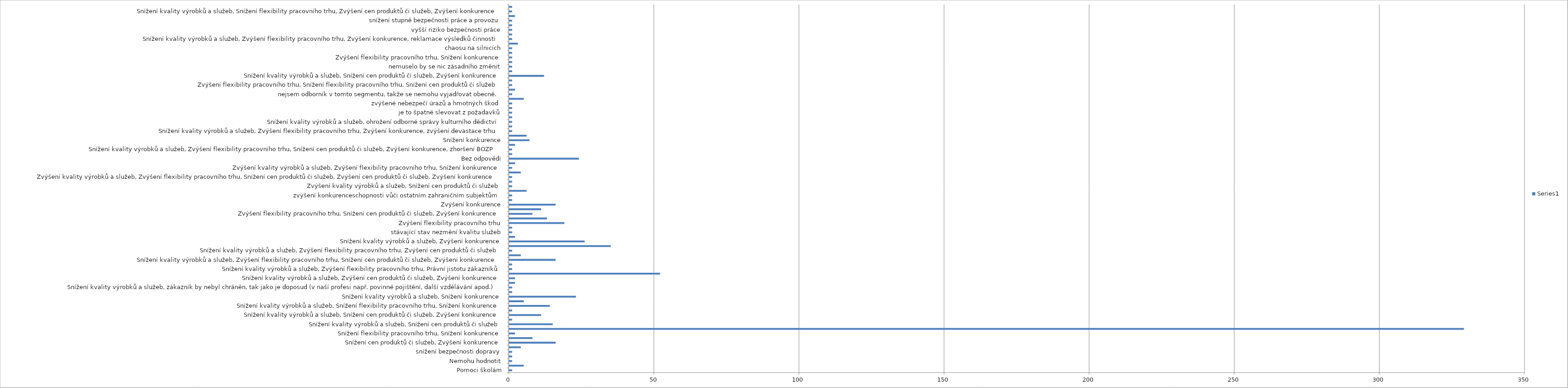
| Category | Series 0 |
|---|---|
| Pomoci školám | 1 |
| Nemám názor | 5 |
| Nemohu hodnotit | 1 |
| požadavky žádné nejsou - kvalita již nízká je | 1 |
| snížení bezpečnosti dopravy | 1 |
| Snížení cen produktů či služeb | 4 |
| Snížení cen produktů či služeb, Zvýšení konkurence | 16 |
| Snížení flexibility pracovního trhu | 8 |
| Snížení flexibility pracovního trhu, Snížení konkurence | 2 |
| Snížení kvality výrobků a služeb | 329 |
| Snížení kvality výrobků a služeb, Snížení cen produktů či služeb | 15 |
| Snížení kvality výrobků a služeb, k excesům v oblasti přestupků a trestního práva | 1 |
| Snížení kvality výrobků a služeb, Snížení cen produktů či služeb, Zvýšení konkurence | 11 |
| Snížení kvality výrobků a služeb, Snížení cen produktů či služeb, Zvýšení konkurence, konkurence nekalé | 1 |
| Snížení kvality výrobků a služeb, Snížení flexibility pracovního trhu, Snížení konkurence | 14 |
| Snížení kvality výrobků a služeb, Snížení flexibility pracovního trhu, Zvýšení cen produktů či služeb, Zvýšení konkurence | 5 |
| Snížení kvality výrobků a služeb, Snížení konkurence | 23 |
| Snížení kvality výrobků a služeb, větším daňovým únikům | 1 |
| Snížení kvality výrobků a služeb, zákazník by nebyl chráněn, tak jako je doposud (v naší profesi např. povinné pojištění, další vzdělávání apod.) | 1 |
| Snížení kvality výrobků a služeb, Zvýšení cen produktů či služeb | 2 |
| Snížení kvality výrobků a služeb, Zvýšení cen produktů či služeb, Zvýšení konkurence | 2 |
| Snížení kvality výrobků a služeb, Zvýšení flexibility pracovního trhu | 52 |
| Snížení kvality výrobků a služeb, Zvýšení flexibility pracovního trhu, Právní jistotu zákazníků | 1 |
| Snížení kvality výrobků a služeb, Zvýšení flexibility pracovního trhu, Snížení cen produktů či služeb | 1 |
| Snížení kvality výrobků a služeb, Zvýšení flexibility pracovního trhu, Snížení cen produktů či služeb, Zvýšení konkurence | 16 |
| Snížení kvality výrobků a služeb, Zvýšení flexibility pracovního trhu, Snížení konkurence, test | 4 |
| Snížení kvality výrobků a služeb, Zvýšení flexibility pracovního trhu, Zvýšení cen produktů či služeb | 1 |
| Snížení kvality výrobků a služeb, Zvýšení flexibility pracovního trhu, Zvýšení konkurence | 35 |
| Snížení kvality výrobků a služeb, Zvýšení konkurence | 26 |
| Snížení kvality výrobků a služeb, Zvýšení kvality výrobků a služeb, Zvýšení flexibility pracovního trhu, Zvýšení konkurence | 2 |
| stávající stav nezmění kvalitu služeb | 1 |
| nemám zkušenost | 1 |
| Zvýšení flexibility pracovního trhu | 19 |
| Zvýšení flexibility pracovního trhu, Snížení cen produktů či služeb | 13 |
| Zvýšení flexibility pracovního trhu, Snížení cen produktů či služeb, Zvýšení konkurence | 8 |
| Zvýšení flexibility pracovního trhu, Zvýšení konkurence | 11 |
| Zvýšení konkurence | 16 |
| Zvýšení konkurence, a zároveň ke zvýšení kvality absolventů | 1 |
| zvýšení konkurenceschopnosti vůči ostatním zahraničním subjektům | 1 |
| Zvýšení kvality výrobků a služeb | 6 |
| Zvýšení kvality výrobků a služeb, Snížení cen produktů či služeb | 1 |
| Zvýšení kvality výrobků a služeb, Snížení cen produktů či služeb, Zvýšení konkurence | 1 |
| Zvýšení kvality výrobků a služeb, Zvýšení flexibility pracovního trhu, Snížení cen produktů či služeb, Zvýšení cen produktů či služeb, Zvýšení konkurence | 1 |
| Zvýšení kvality výrobků a služeb, Zvýšení flexibility pracovního trhu, Snížení cen produktů či služeb, Zvýšení konkurence | 4 |
| Zvýšení kvality výrobků a služeb, Zvýšení flexibility pracovního trhu, Snížení konkurence | 1 |
| Zvýšení kvality výrobků a služeb, Zvýšení flexibility pracovního trhu, Zvýšení konkurence | 2 |
| Bez odpovědi | 24 |
| Snížení kvality výrobků a služeb, ohrožení bezpečnosti drážní dopravy | 1 |
| Snížení kvality výrobků a služeb, Zvýšení flexibility pracovního trhu, Snížení cen produktů či služeb, Zvýšení konkurence, zhoršení BOZP | 1 |
| Snížení kvality výrobků a služeb, Snížení cen produktů či služeb, Snížení konkurence | 2 |
| Snížení konkurence | 7 |
| Snížení kvality výrobků a služeb, Snížení cen produktů či služeb | 6 |
| Snížení kvality výrobků a služeb, Zvýšení flexibility pracovního trhu, Zvýšení konkurence, zvýšení devastace trhu | 1 |
| Snížení kvality výrobků a služeb, Snížení cen produktů či služeb, Snížení konkurence, v naší oblasti vykonávané práce je jediným a rozhodujícím ukazatelem kvalita | 1 |
| Snížení kvality výrobků a služeb, ohrožení odborné správy kulturního dědictví | 1 |
| uplatnění v oboru | 1 |
| je to špatné slevovat z požadavků | 1 |
| Zvýšení flexibility pracovního trhu, zaměstnávání Čechů namísto cizinců | 1 |
| zvýšené nebezpečí úrazů a hmotných škod | 1 |
| nevím | 5 |
| nejsem odborník v tomto segmentu, takže se nemohu vyjadřovat obecně. | 1 |
| Snížení kvality výrobků a služeb, Zvýšení flexibility pracovního trhu, Snížení cen produktů či služeb, Snížení konkurence | 2 |
| Zvýšení flexibility pracovního trhu, Snížení flexibility pracovního trhu, Snížení cen produktů či služeb | 1 |
| Zvýšení kvality výrobků a služeb, Zvýšení flexibility pracovního trhu, Zvýšení cen produktů či služeb, Zvýšení konkurence | 1 |
| Snížení kvality výrobků a služeb, Snížení cen produktů či služeb, Zvýšení konkurence | 12 |
| Zvýšení kvality výrobků a služeb, Zvýšení flexibility pracovního trhu, Snížení cen produktů či služeb, Zvýšení konkurence | 1 |
| nemuselo by se nic zásadního změnit | 1 |
| Snížení kvality výrobků a služeb, ohrožení zdraví a životního prostředí | 1 |
| Zvýšení flexibility pracovního trhu, Snížení konkurence | 1 |
| Snížení kvality výrobků a služeb, Snížení flexibility pracovního trhu, Snížení cen produktů či služeb, Degradaci  a  úpadku | 1 |
| chaosu na silnicích | 1 |
| nemám názor | 3 |
| Snížení kvality výrobků a služeb, Zvýšení flexibility pracovního trhu, Zvýšení konkurence, reklamace výsledků činnosti | 1 |
| nemám na mysli snížení požadavků, jen přesnou specifikaci | 1 |
| vyšší riziko bezpečnosti práce | 1 |
| zhoršení výkonu st. správy | 1 |
| snížení stupně bezpečnosti práce a provozu | 1 |
| Snížení kvality výrobků a služeb, Snížení flexibility pracovního trhu, Snížení cen produktů či služeb, Snížení konkurence | 2 |
| Snížení kvality výrobků a služeb, Snížení flexibility pracovního trhu, Zvýšení cen produktů či služeb, Zvýšení konkurence | 1 |
| snížení řemeslné hodnoty | 1 |